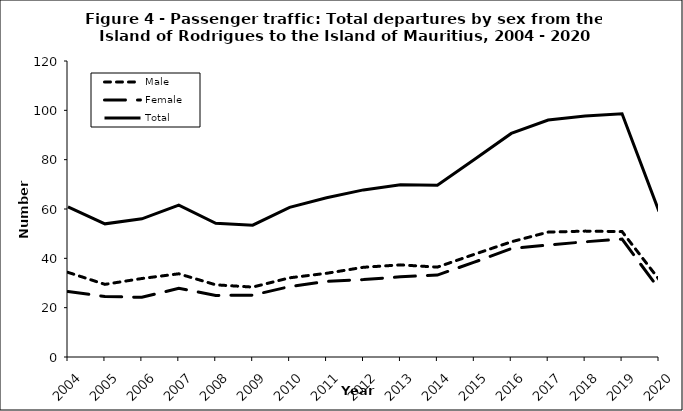
| Category | Male | Female | Total |
|---|---|---|---|
| 2004.0 | 34.314 | 26.516 | 60.83 |
| 2005.0 | 29.447 | 24.54 | 53.987 |
| 2006.0 | 31.822 | 24.193 | 56.015 |
| 2007.0 | 33.735 | 27.86 | 61.595 |
| 2008.0 | 29.26 | 24.952 | 54.212 |
| 2009.0 | 28.341 | 25.085 | 53.426 |
| 2010.0 | 32.101 | 28.561 | 60.662 |
| 2011.0 | 33.938 | 30.626 | 64.564 |
| 2012.0 | 36.372 | 31.373 | 67.745 |
| 2013.0 | 37.348 | 32.5 | 69.848 |
| 2014.0 | 36.435 | 33.225 | 69.66 |
| 2015.0 | 41.629 | 38.45 | 80.079 |
| 2016.0 | 46.691 | 43.936 | 90.627 |
| 2017.0 | 50.632 | 45.416 | 96.048 |
| 2018.0 | 51.034 | 46.705 | 97.739 |
| 2019.0 | 50.846 | 47.791 | 98.637 |
| 2020.0 | 31.431 | 27.6 | 59.031 |